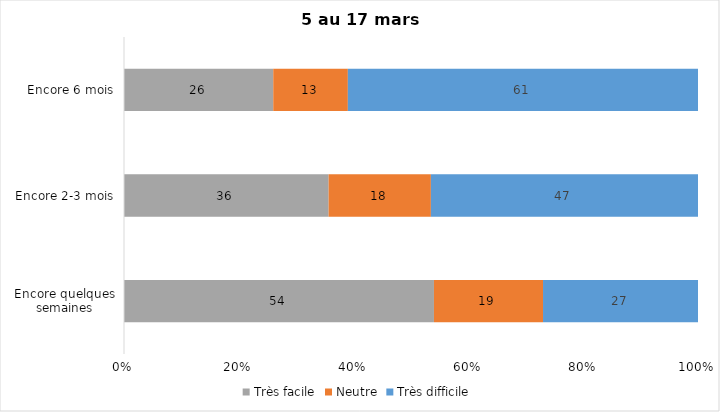
| Category | Très facile | Neutre | Très difficile |
|---|---|---|---|
| Encore quelques semaines | 54 | 19 | 27 |
| Encore 2-3 mois | 36 | 18 | 47 |
| Encore 6 mois | 26 | 13 | 61 |